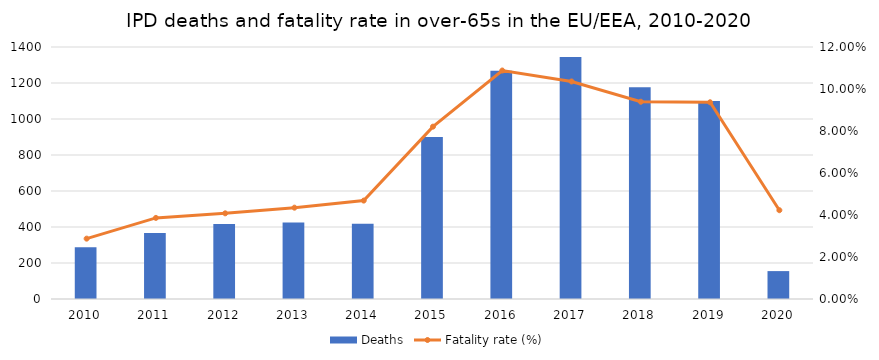
| Category | Deaths |
|---|---|
| 2010.0 | 288 |
| 2011.0 | 367 |
| 2012.0 | 417 |
| 2013.0 | 425 |
| 2014.0 | 418 |
| 2015.0 | 900 |
| 2016.0 | 1268 |
| 2017.0 | 1345 |
| 2018.0 | 1176 |
| 2019.0 | 1100 |
| 2020.0 | 155 |